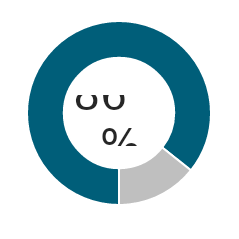
| Category | Series 0 |
|---|---|
| 0 | 0.857 |
| 1 | 0.143 |